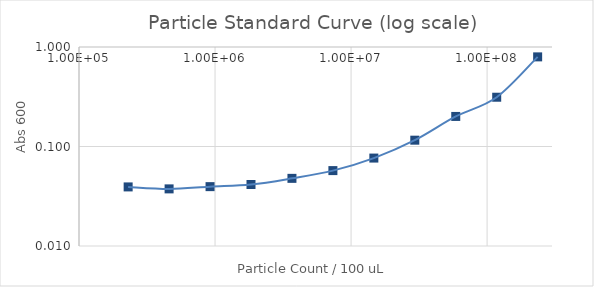
| Category | Series 1 |
|---|---|
| 235294117.64705887 | 0.796 |
| 117647058.82352944 | 0.313 |
| 58823529.41176472 | 0.2 |
| 29411764.70588236 | 0.116 |
| 14705882.35294118 | 0.076 |
| 7352941.17647059 | 0.057 |
| 3676470.588235295 | 0.048 |
| 1838235.2941176475 | 0.042 |
| 919117.6470588237 | 0.039 |
| 459558.82352941186 | 0.038 |
| 229779.41176470593 | 0.039 |